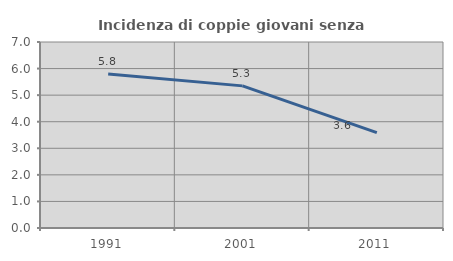
| Category | Incidenza di coppie giovani senza figli |
|---|---|
| 1991.0 | 5.794 |
| 2001.0 | 5.349 |
| 2011.0 | 3.588 |